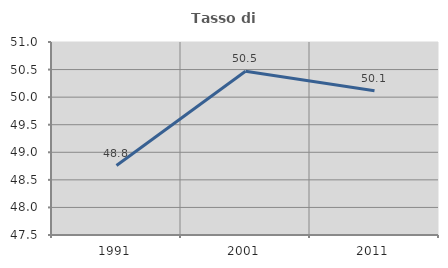
| Category | Tasso di occupazione   |
|---|---|
| 1991.0 | 48.76 |
| 2001.0 | 50.469 |
| 2011.0 | 50.116 |